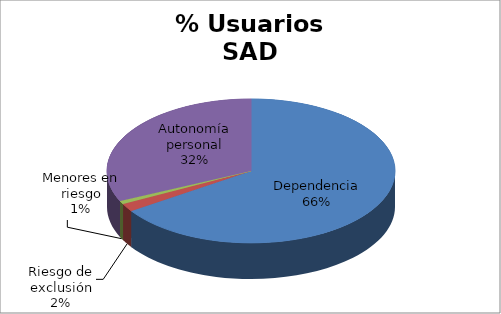
| Category | Series 0 |
|---|---|
| Dependencia | 2921 |
| Riesgo de exclusión | 80 |
| Menores en riesgo | 34 |
| Autonomía personal | 1419 |